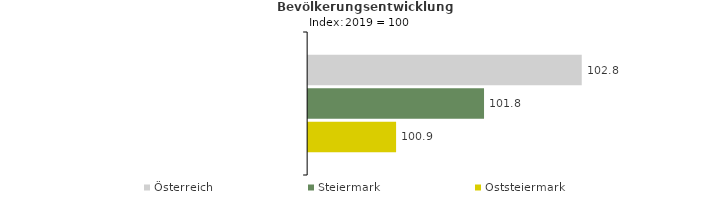
| Category | Österreich | Steiermark | Oststeiermark |
|---|---|---|---|
| 2023.0 | 102.8 | 101.8 | 100.9 |